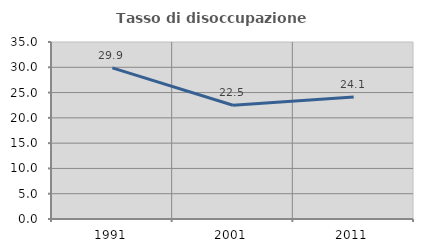
| Category | Tasso di disoccupazione giovanile  |
|---|---|
| 1991.0 | 29.885 |
| 2001.0 | 22.5 |
| 2011.0 | 24.138 |